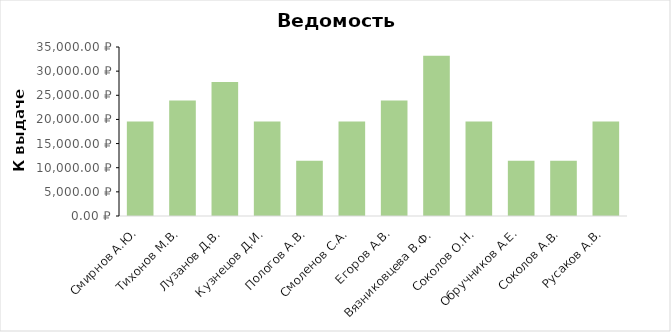
| Category | Series 0 |
|---|---|
| Смирнов А.Ю. | 19575 |
| Тихонов М.В. | 23925 |
| Лузанов Д.В. | 27731.25 |
| Кузнецов Д.И. | 19575 |
| Пологов А.В. | 11418.75 |
| Смоленов С.А. | 19575 |
| Егоров А.В. | 23925 |
| Вязниковцева В.Ф. | 33168.75 |
| Соколов О.Н. | 19575 |
| Обручников А.Е. | 11418.75 |
| Соколов А.В. | 11418.75 |
| Русаков А.В. | 19575 |